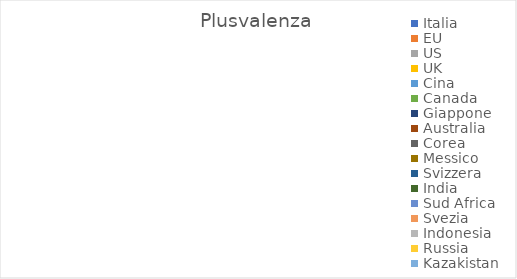
| Category | Plusvalenza |
|---|---|
| Italia | 0 |
| EU | 0 |
| US | 0 |
| UK | 0 |
| Cina | 0 |
| Canada | 0 |
| Giappone | 0 |
| Australia | 0 |
| Corea | 0 |
| Messico | 0 |
| Svizzera | 0 |
| India | 0 |
| Sud Africa | 0 |
| Svezia | 0 |
| Indonesia | 0 |
| Russia | 0 |
| Kazakistan | 0 |